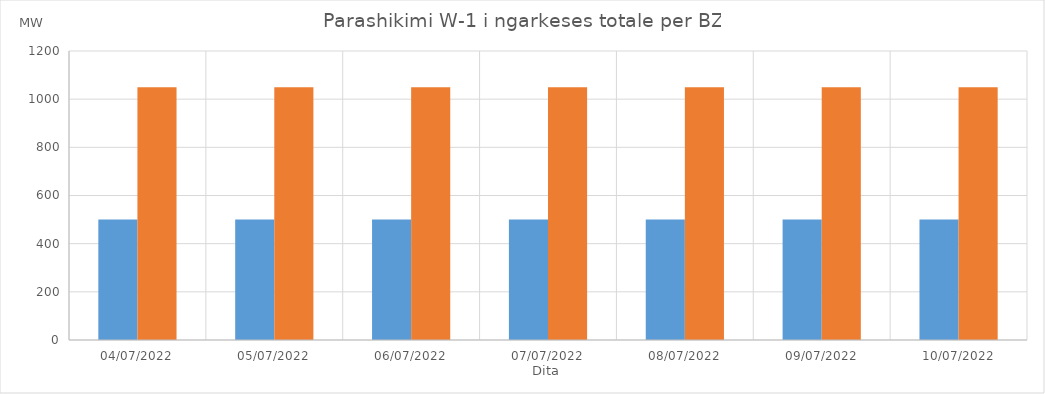
| Category | Min (MW) | Max (MW) |
|---|---|---|
| 04/07/2022 | 500 | 1050 |
| 05/07/2022 | 500 | 1050 |
| 06/07/2022 | 500 | 1050 |
| 07/07/2022 | 500 | 1050 |
| 08/07/2022 | 500 | 1050 |
| 09/07/2022 | 500 | 1050 |
| 10/07/2022 | 500 | 1050 |